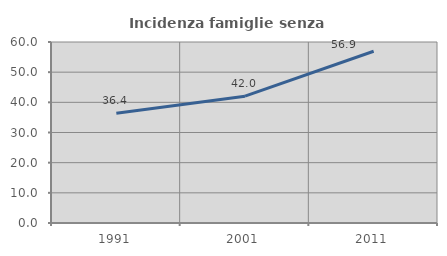
| Category | Incidenza famiglie senza nuclei |
|---|---|
| 1991.0 | 36.41 |
| 2001.0 | 42.033 |
| 2011.0 | 56.936 |